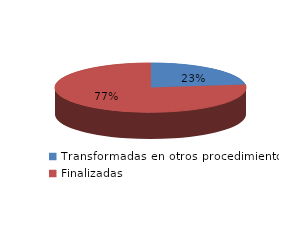
| Category | Series 0 |
|---|---|
| Transformadas en otros procedimientos | 1833 |
| Finalizadas | 6119 |